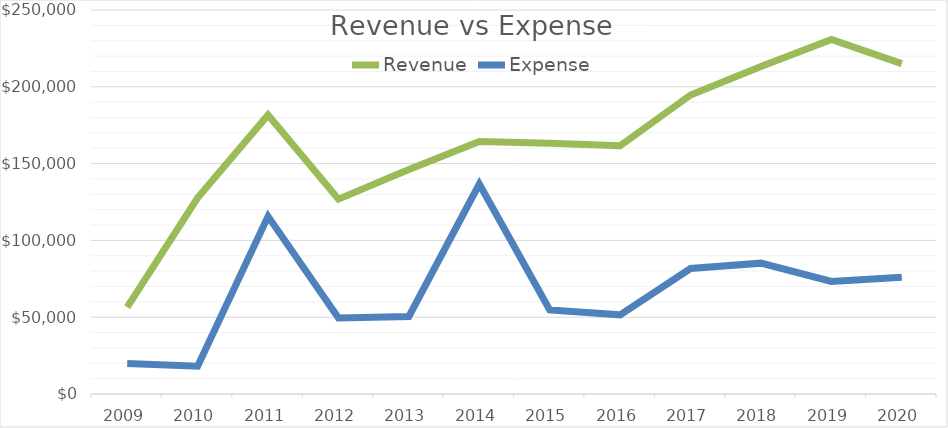
| Category | Revenue | Expense |
|---|---|---|
| 2009.0 | 56567.98 | 19897.72 |
| 2010.0 | 127763.95 | 18068.31 |
| 2011.0 | 181665.32 | 115641.44 |
| 2012.0 | 126869.73 | 49428.89 |
| 2013.0 | 146111.93 | 50461.48 |
| 2014.0 | 164393.95 | 136628.87 |
| 2015.0 | 163311.92 | 54691.43 |
| 2016.0 | 161611.86 | 51550.36 |
| 2017.0 | 194673.94 | 81682.27 |
| 2018.0 | 213284.2 | 85197.47 |
| 2019.0 | 230885.29 | 73253.44 |
| 2020.0 | 215050 | 76076.71 |